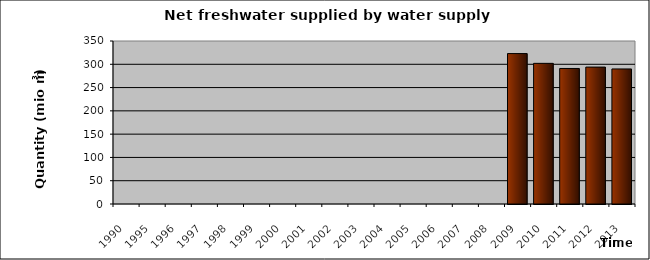
| Category | 1990 1995 1996 1997 1998 1999 2000 2001 2002 2003 2004 2005 2006 2007 2008 2009 2010 2011 2012 2013 |
|---|---|
| 1990 | 0 |
| 1995 | 0 |
| 1996 | 0 |
| 1997 | 0 |
| 1998 | 0 |
| 1999 | 0 |
| 2000 | 0 |
| 2001 | 0 |
| 2002 | 0 |
| 2003 | 0 |
| 2004 | 0 |
| 2005 | 0 |
| 2006 | 0 |
| 2007 | 0 |
| 2008 | 0 |
| 2009 | 323 |
| 2010 | 302 |
| 2011 | 291 |
| 2012 | 294 |
| 2013 | 290 |